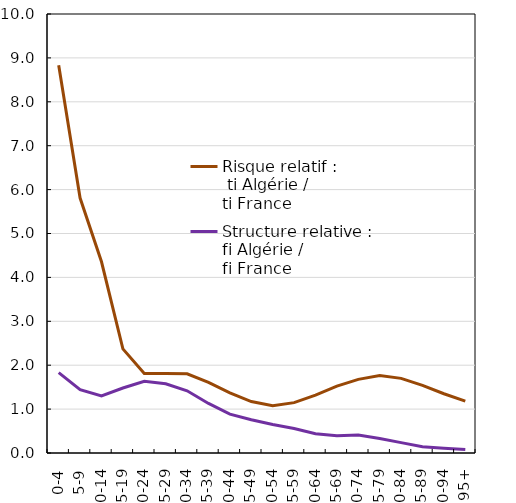
| Category | Risque relatif :
 ti Algérie / 
ti France | Structure relative :
fi Algérie / 
fi France |
|---|---|---|
| 0-4 | 8.835 | 1.83 |
| 5-9 | 5.807 | 1.445 |
| 10-14 | 4.356 | 1.298 |
| 15-19 | 2.372 | 1.481 |
| 20-24 | 1.812 | 1.635 |
| 25-29 | 1.811 | 1.578 |
| 30-34 | 1.803 | 1.417 |
| 35-39 | 1.607 | 1.129 |
| 40-44 | 1.371 | 0.886 |
| 45-49 | 1.172 | 0.756 |
| 50-54 | 1.076 | 0.648 |
| 55-59 | 1.147 | 0.558 |
| 60-64 | 1.319 | 0.44 |
| 65-69 | 1.522 | 0.391 |
| 70-74 | 1.678 | 0.409 |
| 75-79 | 1.767 | 0.332 |
| 80-84 | 1.701 | 0.237 |
| 85-89 | 1.539 | 0.142 |
| 90-94 | 1.349 | 0.108 |
| 95+ | 1.182 | 0.078 |